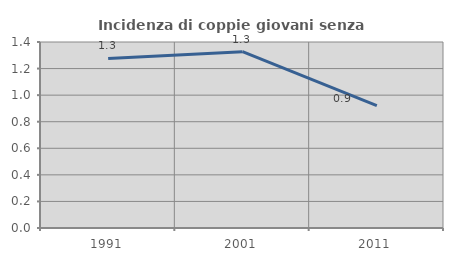
| Category | Incidenza di coppie giovani senza figli |
|---|---|
| 1991.0 | 1.277 |
| 2001.0 | 1.327 |
| 2011.0 | 0.922 |